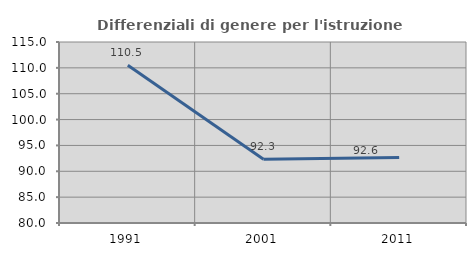
| Category | Differenziali di genere per l'istruzione superiore |
|---|---|
| 1991.0 | 110.52 |
| 2001.0 | 92.326 |
| 2011.0 | 92.647 |